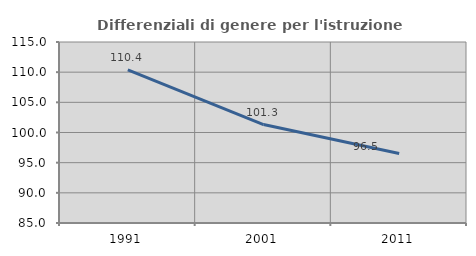
| Category | Differenziali di genere per l'istruzione superiore |
|---|---|
| 1991.0 | 110.383 |
| 2001.0 | 101.323 |
| 2011.0 | 96.523 |